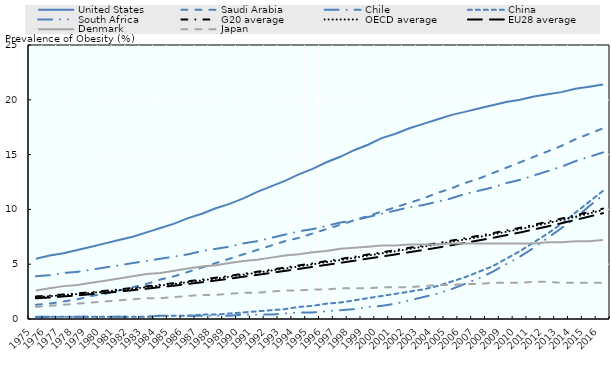
| Category | United States | Saudi Arabia | Chile | China | South Africa | G20 average | OECD average | EU28 average | Denmark | Japan |
|---|---|---|---|---|---|---|---|---|---|---|
| 1975.0 | 5.5 | 1.3 | 3.9 | 0.1 | 0.2 | 2.058 | 2 | 1.892 | 2.6 | 1.1 |
| 1976.0 | 5.8 | 1.4 | 4 | 0.2 | 0.2 | 2.137 | 2.078 | 1.965 | 2.8 | 1.2 |
| 1977.0 | 6 | 1.6 | 4.2 | 0.2 | 0.2 | 2.24 | 2.18 | 2.063 | 3 | 1.3 |
| 1978.0 | 6.3 | 1.8 | 4.3 | 0.2 | 0.2 | 2.34 | 2.278 | 2.157 | 3.1 | 1.4 |
| 1979.0 | 6.6 | 2.1 | 4.5 | 0.2 | 0.2 | 2.452 | 2.388 | 2.263 | 3.3 | 1.5 |
| 1980.0 | 6.9 | 2.3 | 4.7 | 0.2 | 0.2 | 2.571 | 2.506 | 2.376 | 3.5 | 1.6 |
| 1981.0 | 7.2 | 2.6 | 4.9 | 0.2 | 0.2 | 2.702 | 2.633 | 2.5 | 3.7 | 1.7 |
| 1982.0 | 7.5 | 2.9 | 5.1 | 0.2 | 0.2 | 2.837 | 2.767 | 2.629 | 3.9 | 1.8 |
| 1983.0 | 7.9 | 3.2 | 5.3 | 0.2 | 0.2 | 2.981 | 2.908 | 2.763 | 4.1 | 1.9 |
| 1984.0 | 8.3 | 3.6 | 5.5 | 0.3 | 0.3 | 3.137 | 3.061 | 2.912 | 4.2 | 1.9 |
| 1985.0 | 8.7 | 3.9 | 5.7 | 0.3 | 0.3 | 3.275 | 3.198 | 3.043 | 4.4 | 2 |
| 1986.0 | 9.2 | 4.3 | 5.9 | 0.3 | 0.3 | 3.444 | 3.365 | 3.202 | 4.6 | 2.1 |
| 1987.0 | 9.6 | 4.7 | 6.2 | 0.4 | 0.3 | 3.602 | 3.522 | 3.353 | 4.8 | 2.2 |
| 1988.0 | 10.1 | 5.1 | 6.4 | 0.4 | 0.3 | 3.771 | 3.688 | 3.512 | 4.9 | 2.2 |
| 1989.0 | 10.5 | 5.5 | 6.6 | 0.5 | 0.3 | 3.94 | 3.857 | 3.676 | 5.1 | 2.3 |
| 1990.0 | 11 | 5.9 | 6.9 | 0.6 | 0.4 | 4.135 | 4.049 | 3.859 | 5.3 | 2.4 |
| 1991.0 | 11.6 | 6.3 | 7.1 | 0.7 | 0.4 | 4.315 | 4.229 | 4.029 | 5.4 | 2.4 |
| 1992.0 | 12.1 | 6.7 | 7.4 | 0.8 | 0.4 | 4.504 | 4.416 | 4.208 | 5.6 | 2.5 |
| 1993.0 | 12.6 | 7.1 | 7.7 | 0.9 | 0.5 | 4.692 | 4.604 | 4.388 | 5.8 | 2.6 |
| 1994.0 | 13.2 | 7.4 | 8 | 1.1 | 0.6 | 4.888 | 4.798 | 4.571 | 5.9 | 2.6 |
| 1995.0 | 13.7 | 7.8 | 8.2 | 1.2 | 0.6 | 5.083 | 4.99 | 4.755 | 6.1 | 2.7 |
| 1996.0 | 14.3 | 8.2 | 8.5 | 1.4 | 0.7 | 5.281 | 5.188 | 4.941 | 6.2 | 2.7 |
| 1997.0 | 14.8 | 8.6 | 8.8 | 1.5 | 0.8 | 5.475 | 5.378 | 5.122 | 6.4 | 2.8 |
| 1998.0 | 15.4 | 9 | 9 | 1.7 | 0.9 | 5.679 | 5.58 | 5.314 | 6.5 | 2.8 |
| 1999.0 | 15.9 | 9.4 | 9.3 | 1.9 | 1.1 | 5.887 | 5.786 | 5.512 | 6.6 | 2.8 |
| 2000.0 | 16.5 | 9.8 | 9.6 | 2.1 | 1.2 | 6.088 | 5.986 | 5.702 | 6.7 | 2.9 |
| 2001.0 | 16.9 | 10.2 | 9.9 | 2.3 | 1.4 | 6.285 | 6.18 | 5.892 | 6.7 | 2.9 |
| 2002.0 | 17.4 | 10.6 | 10.2 | 2.5 | 1.7 | 6.498 | 6.392 | 6.096 | 6.8 | 2.9 |
| 2003.0 | 17.8 | 11 | 10.4 | 2.7 | 2 | 6.706 | 6.598 | 6.296 | 6.8 | 3 |
| 2004.0 | 18.2 | 11.5 | 10.7 | 3 | 2.3 | 6.917 | 6.808 | 6.502 | 6.8 | 3.1 |
| 2005.0 | 18.6 | 11.9 | 11 | 3.4 | 2.7 | 7.146 | 7.033 | 6.724 | 6.9 | 3.1 |
| 2006.0 | 18.9 | 12.4 | 11.4 | 3.8 | 3.2 | 7.367 | 7.253 | 6.943 | 6.9 | 3.2 |
| 2007.0 | 19.2 | 12.8 | 11.7 | 4.3 | 3.7 | 7.594 | 7.478 | 7.167 | 6.9 | 3.2 |
| 2008.0 | 19.5 | 13.3 | 12 | 4.8 | 4.3 | 7.827 | 7.708 | 7.398 | 6.9 | 3.3 |
| 2009.0 | 19.8 | 13.8 | 12.4 | 5.5 | 5 | 8.079 | 7.959 | 7.649 | 6.9 | 3.3 |
| 2010.0 | 20 | 14.3 | 12.7 | 6.2 | 5.7 | 8.323 | 8.2 | 7.894 | 6.9 | 3.3 |
| 2011.0 | 20.3 | 14.8 | 13.1 | 7 | 6.5 | 8.6 | 8.476 | 8.171 | 6.9 | 3.4 |
| 2012.0 | 20.5 | 15.3 | 13.5 | 7.8 | 7.4 | 8.877 | 8.751 | 8.451 | 7 | 3.4 |
| 2013.0 | 20.7 | 15.8 | 13.9 | 8.7 | 8.3 | 9.163 | 9.035 | 8.739 | 7 | 3.3 |
| 2014.0 | 21 | 16.4 | 14.4 | 9.7 | 9.2 | 9.467 | 9.337 | 9.043 | 7.1 | 3.3 |
| 2015.0 | 21.2 | 16.9 | 14.8 | 10.7 | 10.3 | 9.767 | 9.635 | 9.347 | 7.1 | 3.3 |
| 2016.0 | 21.4 | 17.4 | 15.2 | 11.7 | 11.3 | 10.075 | 9.941 | 9.657 | 7.2 | 3.3 |